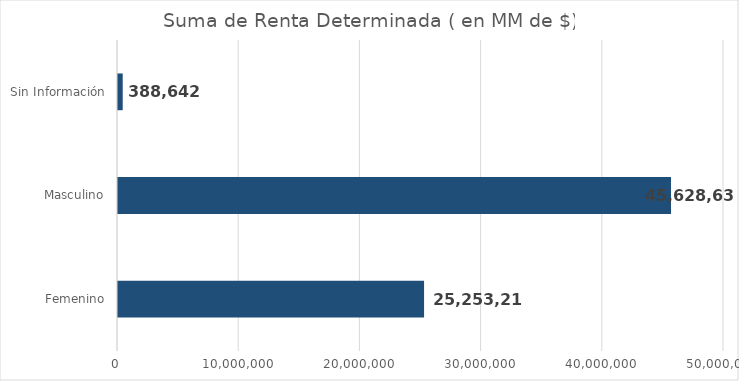
| Category | Series 0 |
|---|---|
| Femenino | 25253216.9 |
| Masculino | 45628632.8 |
| Sin Información | 388642.3 |